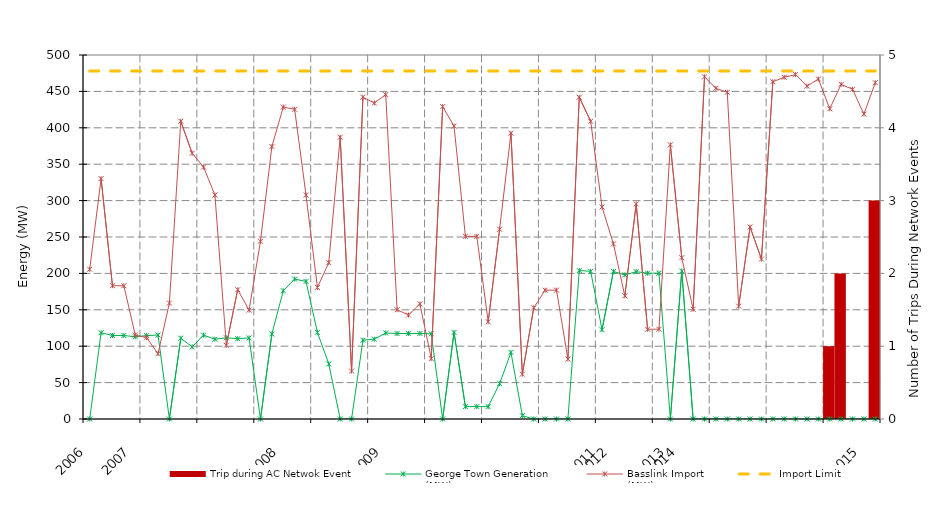
| Category | Trip during AC Netwok Event |
|---|---|
| 2006.0 | 0 |
| nan | 0 |
| nan | 0 |
| nan | 0 |
| 2007.0 | 0 |
| nan | 0 |
| nan | 0 |
| nan | 0 |
| nan | 0 |
| nan | 0 |
| nan | 0 |
| nan | 0 |
| nan | 0 |
| nan | 0 |
| nan | 0 |
| nan | 0 |
| nan | 0 |
| 2008.0 | 0 |
| nan | 0 |
| nan | 0 |
| nan | 0 |
| nan | 0 |
| nan | 0 |
| nan | 0 |
| nan | 0 |
| nan | 0 |
| 2009.0 | 0 |
| nan | 0 |
| nan | 0 |
| nan | 0 |
| nan | 0 |
| nan | 0 |
| nan | 0 |
| nan | 0 |
| nan | 0 |
| nan | 0 |
| nan | 0 |
| nan | 0 |
| nan | 0 |
| nan | 0 |
| nan | 0 |
| nan | 0 |
| nan | 0 |
| nan | 0 |
| nan | 0 |
| 2011.0 | 0 |
| 2012.0 | 0 |
| nan | 0 |
| nan | 0 |
| nan | 0 |
| nan | 0 |
| 2013.0 | 0 |
| 2014.0 | 0 |
| nan | 0 |
| nan | 0 |
| nan | 0 |
| nan | 0 |
| nan | 0 |
| nan | 0 |
| nan | 0 |
| nan | 0 |
| nan | 0 |
| nan | 0 |
| nan | 0 |
| nan | 0 |
| nan | 1 |
| nan | 2 |
| nan | 0 |
| 2015.0 | 0 |
| nan | 3 |